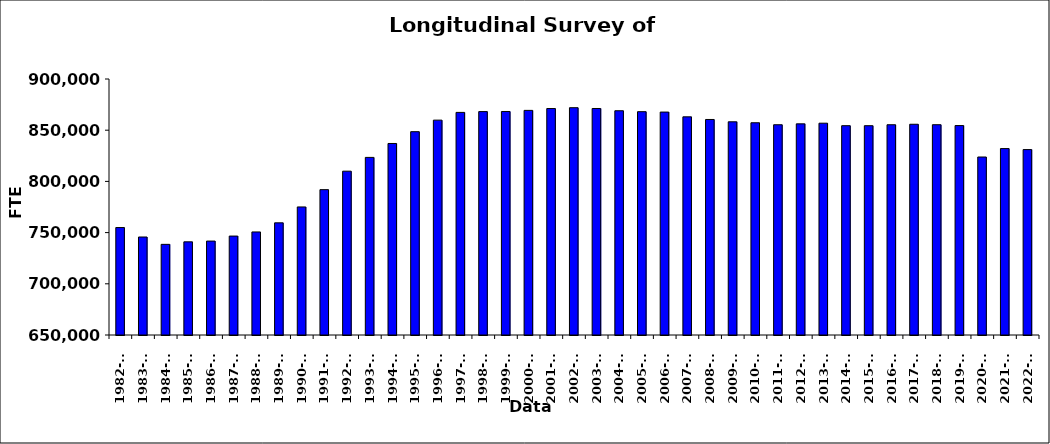
| Category | Series 0 |
|---|---|
| 1982-83 | 754938 |
| 1983-84 | 745702 |
| 1984-85 | 738525 |
| 1985-86 | 740976 |
| 1986-87 | 741733 |
| 1987-88 | 746615 |
| 1988-89 | 750642 |
| 1989-90 | 759531 |
| 1990-91 | 775056 |
| 1991-92 | 791938 |
| 1992-93 | 809982 |
| 1993-94 | 823435 |
| 1994-95 | 837028 |
| 1995-96 | 848559 |
| 1996-97 | 859830 |
| 1997-98 | 867380 |
| 1998-99 | 868161 |
| 1999-00 | 868279 |
| 2000-01 | 869357 |
| 2001-02 | 871154 |
| 2002-03 | 871981 |
| 2003-04 | 871202 |
| 2004-05 | 869005 |
| 2005-06 | 868092 |
| 2006-07 | 867698 |
| 2007-08 | 863047 |
| 2008-09 | 860477 |
| 2009-10 | 858205 |
| 2010-11 | 857273 |
| 2011-12 | 855327 |
| 2012-13 | 856203 |
| 2013-14 | 856846 |
| 2014-15 | 854419 |
| 2015-16 | 854403 |
| 2016-17 | 855329 |
| 2017-18 | 855804 |
| 2018-19 | 855360 |
| 2019-20 | 854521 |
| 2020-21 | 823827 |
| 2021-22 | 832045 |
| 2022-23 | 831070 |